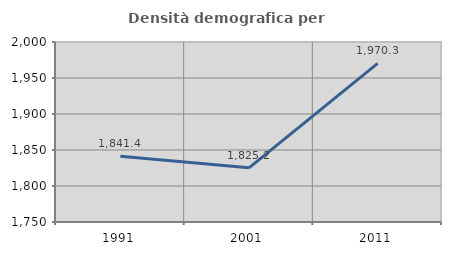
| Category | Densità demografica |
|---|---|
| 1991.0 | 1841.411 |
| 2001.0 | 1825.224 |
| 2011.0 | 1970.325 |